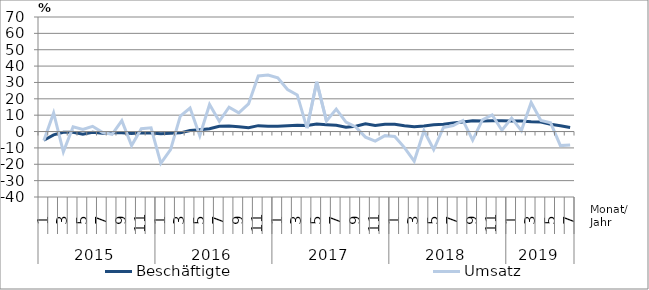
| Category | Beschäftigte | Umsatz |
|---|---|---|
| 0 | -5.3 | -5.5 |
| 1 | -2 | 11.4 |
| 2 | -0.5 | -12.4 |
| 3 | -0.5 | 2.9 |
| 4 | -1.7 | 1.3 |
| 5 | -0.5 | 3.2 |
| 6 | -1.1 | -0.5 |
| 7 | -0.8 | -1.7 |
| 8 | -0.7 | 6.7 |
| 9 | -1.2 | -8.5 |
| 10 | -0.7 | 1.7 |
| 11 | -0.9 | 2.3 |
| 12 | -1.3 | -19.4 |
| 13 | -1.1 | -11 |
| 14 | -0.8 | 9.4 |
| 15 | 0.6 | 14.4 |
| 16 | 1.1 | -2.6 |
| 17 | 1.7 | 16.5 |
| 18 | 3.2 | 6.3 |
| 19 | 3.4 | 14.9 |
| 20 | 3 | 11.4 |
| 21 | 2.4 | 16.9 |
| 22 | 3.6 | 34 |
| 23 | 3.2 | 34.5 |
| 24 | 3.3 | 32.8 |
| 25 | 3.6 | 25.7 |
| 26 | 3.9 | 22.4 |
| 27 | 3.7 | 2.1 |
| 28 | 4.6 | 30.4 |
| 29 | 4.2 | 6.4 |
| 30 | 3.8 | 13.7 |
| 31 | 2.7 | 5.8 |
| 32 | 3.3 | 2.8 |
| 33 | 4.7 | -3.4 |
| 34 | 3.7 | -5.8 |
| 35 | 4.4 | -2.5 |
| 36 | 4.5 | -3 |
| 37 | 3.6 | -9.8 |
| 38 | 2.9 | -18.1 |
| 39 | 3.4 | 0.5 |
| 40 | 4.2 | -11 |
| 41 | 4.5 | 2.5 |
| 42 | 5.3 | 3.7 |
| 43 | 5.8 | 6.8 |
| 44 | 6.6 | -5.2 |
| 45 | 6.5 | 7.1 |
| 46 | 6.6 | 10.1 |
| 47 | 6.6 | 0.8 |
| 48 | 6.4 | 8.2 |
| 49 | 6.5 | 0.6 |
| 50 | 6 | 17.8 |
| 51 | 5.8 | 6.8 |
| 52 | 4.5 | 5.3 |
| 53 | 3.6 | -8.6 |
| 54 | 2.5 | -8.2 |